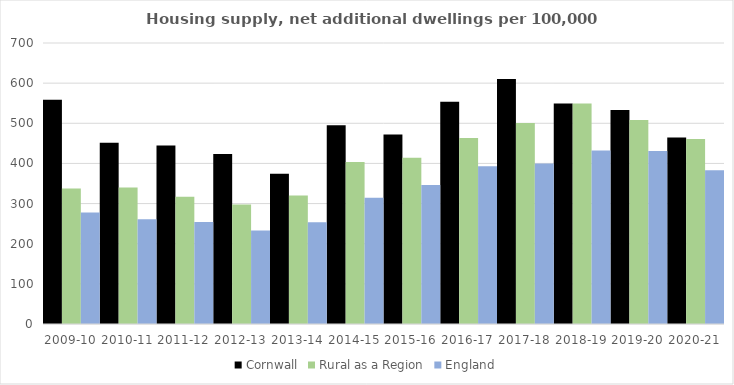
| Category | Cornwall | Rural as a Region | England |
|---|---|---|---|
| 2009-10 | 558.358 | 337.852 | 277.548 |
| 2010-11 | 451.496 | 340.105 | 260.994 |
| 2011-12 | 444.957 | 317.04 | 254.007 |
| 2012-13 | 423.224 | 297.763 | 233.153 |
| 2013-14 | 374.538 | 319.835 | 253.602 |
| 2014-15 | 494.907 | 403.796 | 314.256 |
| 2015-16 | 471.939 | 414.091 | 346.154 |
| 2016-17 | 553.817 | 463.209 | 393.256 |
| 2017-18 | 610.494 | 500.68 | 399.646 |
| 2018-19 | 549.324 | 549.491 | 432.099 |
| 2019-20 | 533.202 | 508.493 | 431.187 |
| 2020-21 | 464.679 | 461.114 | 382.827 |